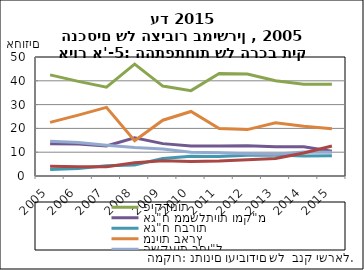
| Category | פיקדונות | אג"ח ממשלתיות ומק"מ | אג"ח חברות | מניות בארץ | השקעות בחו"ל | מזומן ועו"ש |
|---|---|---|---|---|---|---|
| 2005-12-31 | 42.486 | 13.561 | 2.753 | 22.534 | 14.55 | 4.052 |
| 2006-12-31 | 39.76 | 13.48 | 3.194 | 25.589 | 14.072 | 3.848 |
| 2007-12-31 | 37.335 | 12.649 | 4.314 | 28.834 | 12.908 | 3.889 |
| 2008-12-31 | 46.988 | 16.072 | 4.653 | 14.83 | 11.935 | 5.531 |
| 2009-12-31 | 37.786 | 13.6 | 7.397 | 23.443 | 11.326 | 6.438 |
| 2010-12-31 | 35.878 | 12.605 | 8.31 | 27.108 | 9.96 | 6.108 |
| 2011-12-31 | 43.101 | 12.632 | 8.226 | 19.964 | 9.725 | 6.338 |
| 2012-12-31 | 42.823 | 12.692 | 8.751 | 19.496 | 9.336 | 6.879 |
| 2013-12-31 | 40.004 | 12.241 | 8.794 | 22.383 | 9.132 | 7.321 |
| 2014-12-31 | 38.531 | 12.267 | 8.354 | 20.943 | 10.088 | 9.701 |
| 2015-12-31 | 38.602 | 10.394 | 8.504 | 19.875 | 10.01 | 12.615 |